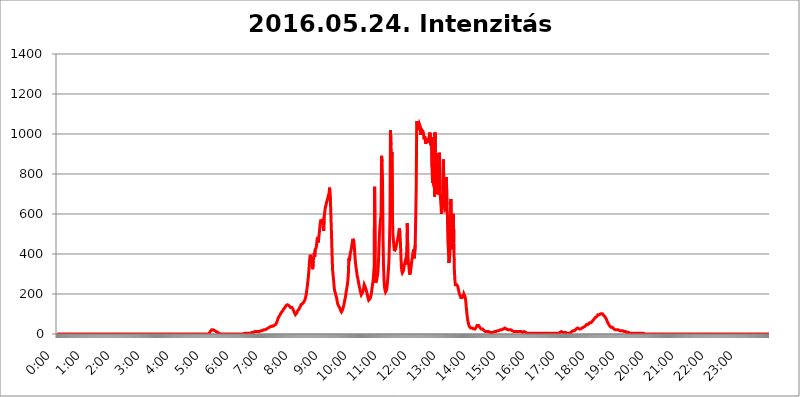
| Category | 2016.05.24. Intenzitás [W/m^2] |
|---|---|
| 0.0 | 0 |
| 0.0006944444444444445 | 0 |
| 0.001388888888888889 | 0 |
| 0.0020833333333333333 | 0 |
| 0.002777777777777778 | 0 |
| 0.003472222222222222 | 0 |
| 0.004166666666666667 | 0 |
| 0.004861111111111111 | 0 |
| 0.005555555555555556 | 0 |
| 0.0062499999999999995 | 0 |
| 0.006944444444444444 | 0 |
| 0.007638888888888889 | 0 |
| 0.008333333333333333 | 0 |
| 0.009027777777777779 | 0 |
| 0.009722222222222222 | 0 |
| 0.010416666666666666 | 0 |
| 0.011111111111111112 | 0 |
| 0.011805555555555555 | 0 |
| 0.012499999999999999 | 0 |
| 0.013194444444444444 | 0 |
| 0.013888888888888888 | 0 |
| 0.014583333333333332 | 0 |
| 0.015277777777777777 | 0 |
| 0.015972222222222224 | 0 |
| 0.016666666666666666 | 0 |
| 0.017361111111111112 | 0 |
| 0.018055555555555557 | 0 |
| 0.01875 | 0 |
| 0.019444444444444445 | 0 |
| 0.02013888888888889 | 0 |
| 0.020833333333333332 | 0 |
| 0.02152777777777778 | 0 |
| 0.022222222222222223 | 0 |
| 0.02291666666666667 | 0 |
| 0.02361111111111111 | 0 |
| 0.024305555555555556 | 0 |
| 0.024999999999999998 | 0 |
| 0.025694444444444447 | 0 |
| 0.02638888888888889 | 0 |
| 0.027083333333333334 | 0 |
| 0.027777777777777776 | 0 |
| 0.02847222222222222 | 0 |
| 0.029166666666666664 | 0 |
| 0.029861111111111113 | 0 |
| 0.030555555555555555 | 0 |
| 0.03125 | 0 |
| 0.03194444444444445 | 0 |
| 0.03263888888888889 | 0 |
| 0.03333333333333333 | 0 |
| 0.034027777777777775 | 0 |
| 0.034722222222222224 | 0 |
| 0.035416666666666666 | 0 |
| 0.036111111111111115 | 0 |
| 0.03680555555555556 | 0 |
| 0.0375 | 0 |
| 0.03819444444444444 | 0 |
| 0.03888888888888889 | 0 |
| 0.03958333333333333 | 0 |
| 0.04027777777777778 | 0 |
| 0.04097222222222222 | 0 |
| 0.041666666666666664 | 0 |
| 0.042361111111111106 | 0 |
| 0.04305555555555556 | 0 |
| 0.043750000000000004 | 0 |
| 0.044444444444444446 | 0 |
| 0.04513888888888889 | 0 |
| 0.04583333333333334 | 0 |
| 0.04652777777777778 | 0 |
| 0.04722222222222222 | 0 |
| 0.04791666666666666 | 0 |
| 0.04861111111111111 | 0 |
| 0.049305555555555554 | 0 |
| 0.049999999999999996 | 0 |
| 0.05069444444444445 | 0 |
| 0.051388888888888894 | 0 |
| 0.052083333333333336 | 0 |
| 0.05277777777777778 | 0 |
| 0.05347222222222222 | 0 |
| 0.05416666666666667 | 0 |
| 0.05486111111111111 | 0 |
| 0.05555555555555555 | 0 |
| 0.05625 | 0 |
| 0.05694444444444444 | 0 |
| 0.057638888888888885 | 0 |
| 0.05833333333333333 | 0 |
| 0.05902777777777778 | 0 |
| 0.059722222222222225 | 0 |
| 0.06041666666666667 | 0 |
| 0.061111111111111116 | 0 |
| 0.06180555555555556 | 0 |
| 0.0625 | 0 |
| 0.06319444444444444 | 0 |
| 0.06388888888888888 | 0 |
| 0.06458333333333334 | 0 |
| 0.06527777777777778 | 0 |
| 0.06597222222222222 | 0 |
| 0.06666666666666667 | 0 |
| 0.06736111111111111 | 0 |
| 0.06805555555555555 | 0 |
| 0.06874999999999999 | 0 |
| 0.06944444444444443 | 0 |
| 0.07013888888888889 | 0 |
| 0.07083333333333333 | 0 |
| 0.07152777777777779 | 0 |
| 0.07222222222222223 | 0 |
| 0.07291666666666667 | 0 |
| 0.07361111111111111 | 0 |
| 0.07430555555555556 | 0 |
| 0.075 | 0 |
| 0.07569444444444444 | 0 |
| 0.0763888888888889 | 0 |
| 0.07708333333333334 | 0 |
| 0.07777777777777778 | 0 |
| 0.07847222222222222 | 0 |
| 0.07916666666666666 | 0 |
| 0.0798611111111111 | 0 |
| 0.08055555555555556 | 0 |
| 0.08125 | 0 |
| 0.08194444444444444 | 0 |
| 0.08263888888888889 | 0 |
| 0.08333333333333333 | 0 |
| 0.08402777777777777 | 0 |
| 0.08472222222222221 | 0 |
| 0.08541666666666665 | 0 |
| 0.08611111111111112 | 0 |
| 0.08680555555555557 | 0 |
| 0.08750000000000001 | 0 |
| 0.08819444444444445 | 0 |
| 0.08888888888888889 | 0 |
| 0.08958333333333333 | 0 |
| 0.09027777777777778 | 0 |
| 0.09097222222222222 | 0 |
| 0.09166666666666667 | 0 |
| 0.09236111111111112 | 0 |
| 0.09305555555555556 | 0 |
| 0.09375 | 0 |
| 0.09444444444444444 | 0 |
| 0.09513888888888888 | 0 |
| 0.09583333333333333 | 0 |
| 0.09652777777777777 | 0 |
| 0.09722222222222222 | 0 |
| 0.09791666666666667 | 0 |
| 0.09861111111111111 | 0 |
| 0.09930555555555555 | 0 |
| 0.09999999999999999 | 0 |
| 0.10069444444444443 | 0 |
| 0.1013888888888889 | 0 |
| 0.10208333333333335 | 0 |
| 0.10277777777777779 | 0 |
| 0.10347222222222223 | 0 |
| 0.10416666666666667 | 0 |
| 0.10486111111111111 | 0 |
| 0.10555555555555556 | 0 |
| 0.10625 | 0 |
| 0.10694444444444444 | 0 |
| 0.1076388888888889 | 0 |
| 0.10833333333333334 | 0 |
| 0.10902777777777778 | 0 |
| 0.10972222222222222 | 0 |
| 0.1111111111111111 | 0 |
| 0.11180555555555556 | 0 |
| 0.11180555555555556 | 0 |
| 0.1125 | 0 |
| 0.11319444444444444 | 0 |
| 0.11388888888888889 | 0 |
| 0.11458333333333333 | 0 |
| 0.11527777777777777 | 0 |
| 0.11597222222222221 | 0 |
| 0.11666666666666665 | 0 |
| 0.1173611111111111 | 0 |
| 0.11805555555555557 | 0 |
| 0.11944444444444445 | 0 |
| 0.12013888888888889 | 0 |
| 0.12083333333333333 | 0 |
| 0.12152777777777778 | 0 |
| 0.12222222222222223 | 0 |
| 0.12291666666666667 | 0 |
| 0.12291666666666667 | 0 |
| 0.12361111111111112 | 0 |
| 0.12430555555555556 | 0 |
| 0.125 | 0 |
| 0.12569444444444444 | 0 |
| 0.12638888888888888 | 0 |
| 0.12708333333333333 | 0 |
| 0.16875 | 0 |
| 0.12847222222222224 | 0 |
| 0.12916666666666668 | 0 |
| 0.12986111111111112 | 0 |
| 0.13055555555555556 | 0 |
| 0.13125 | 0 |
| 0.13194444444444445 | 0 |
| 0.1326388888888889 | 0 |
| 0.13333333333333333 | 0 |
| 0.13402777777777777 | 0 |
| 0.13402777777777777 | 0 |
| 0.13472222222222222 | 0 |
| 0.13541666666666666 | 0 |
| 0.1361111111111111 | 0 |
| 0.13749999999999998 | 0 |
| 0.13819444444444443 | 0 |
| 0.1388888888888889 | 0 |
| 0.13958333333333334 | 0 |
| 0.14027777777777778 | 0 |
| 0.14097222222222222 | 0 |
| 0.14166666666666666 | 0 |
| 0.1423611111111111 | 0 |
| 0.14305555555555557 | 0 |
| 0.14375000000000002 | 0 |
| 0.14444444444444446 | 0 |
| 0.1451388888888889 | 0 |
| 0.1451388888888889 | 0 |
| 0.14652777777777778 | 0 |
| 0.14722222222222223 | 0 |
| 0.14791666666666667 | 0 |
| 0.1486111111111111 | 0 |
| 0.14930555555555555 | 0 |
| 0.15 | 0 |
| 0.15069444444444444 | 0 |
| 0.15138888888888888 | 0 |
| 0.15208333333333332 | 0 |
| 0.15277777777777776 | 0 |
| 0.15347222222222223 | 0 |
| 0.15416666666666667 | 0 |
| 0.15486111111111112 | 0 |
| 0.15555555555555556 | 0 |
| 0.15625 | 0 |
| 0.15694444444444444 | 0 |
| 0.15763888888888888 | 0 |
| 0.15833333333333333 | 0 |
| 0.15902777777777777 | 0 |
| 0.15972222222222224 | 0 |
| 0.16041666666666668 | 0 |
| 0.16111111111111112 | 0 |
| 0.16180555555555556 | 0 |
| 0.1625 | 0 |
| 0.16319444444444445 | 0 |
| 0.1638888888888889 | 0 |
| 0.16458333333333333 | 0 |
| 0.16527777777777777 | 0 |
| 0.16597222222222222 | 0 |
| 0.16666666666666666 | 0 |
| 0.1673611111111111 | 0 |
| 0.16805555555555554 | 0 |
| 0.16874999999999998 | 0 |
| 0.16944444444444443 | 0 |
| 0.17013888888888887 | 0 |
| 0.1708333333333333 | 0 |
| 0.17152777777777775 | 0 |
| 0.17222222222222225 | 0 |
| 0.1729166666666667 | 0 |
| 0.17361111111111113 | 0 |
| 0.17430555555555557 | 0 |
| 0.17500000000000002 | 0 |
| 0.17569444444444446 | 0 |
| 0.1763888888888889 | 0 |
| 0.17708333333333334 | 0 |
| 0.17777777777777778 | 0 |
| 0.17847222222222223 | 0 |
| 0.17916666666666667 | 0 |
| 0.1798611111111111 | 0 |
| 0.18055555555555555 | 0 |
| 0.18125 | 0 |
| 0.18194444444444444 | 0 |
| 0.1826388888888889 | 0 |
| 0.18333333333333335 | 0 |
| 0.1840277777777778 | 0 |
| 0.18472222222222223 | 0 |
| 0.18541666666666667 | 0 |
| 0.18611111111111112 | 0 |
| 0.18680555555555556 | 0 |
| 0.1875 | 0 |
| 0.18819444444444444 | 0 |
| 0.18888888888888888 | 0 |
| 0.18958333333333333 | 0 |
| 0.19027777777777777 | 0 |
| 0.1909722222222222 | 0 |
| 0.19166666666666665 | 0 |
| 0.19236111111111112 | 0 |
| 0.19305555555555554 | 0 |
| 0.19375 | 0 |
| 0.19444444444444445 | 0 |
| 0.1951388888888889 | 0 |
| 0.19583333333333333 | 0 |
| 0.19652777777777777 | 0 |
| 0.19722222222222222 | 0 |
| 0.19791666666666666 | 0 |
| 0.1986111111111111 | 0 |
| 0.19930555555555554 | 0 |
| 0.19999999999999998 | 0 |
| 0.20069444444444443 | 0 |
| 0.20138888888888887 | 0 |
| 0.2020833333333333 | 0 |
| 0.2027777777777778 | 0 |
| 0.2034722222222222 | 0 |
| 0.2041666666666667 | 0 |
| 0.20486111111111113 | 0 |
| 0.20555555555555557 | 0 |
| 0.20625000000000002 | 0 |
| 0.20694444444444446 | 0 |
| 0.2076388888888889 | 0 |
| 0.20833333333333334 | 0 |
| 0.20902777777777778 | 0 |
| 0.20972222222222223 | 0 |
| 0.21041666666666667 | 0 |
| 0.2111111111111111 | 0 |
| 0.21180555555555555 | 0 |
| 0.2125 | 0 |
| 0.21319444444444444 | 3.525 |
| 0.2138888888888889 | 3.525 |
| 0.21458333333333335 | 12.257 |
| 0.2152777777777778 | 12.257 |
| 0.21597222222222223 | 16.636 |
| 0.21666666666666667 | 21.024 |
| 0.21736111111111112 | 21.024 |
| 0.21805555555555556 | 21.024 |
| 0.21875 | 21.024 |
| 0.21944444444444444 | 16.636 |
| 0.22013888888888888 | 16.636 |
| 0.22083333333333333 | 16.636 |
| 0.22152777777777777 | 16.636 |
| 0.2222222222222222 | 12.257 |
| 0.22291666666666665 | 12.257 |
| 0.2236111111111111 | 7.887 |
| 0.22430555555555556 | 7.887 |
| 0.225 | 7.887 |
| 0.22569444444444445 | 3.525 |
| 0.2263888888888889 | 3.525 |
| 0.22708333333333333 | 3.525 |
| 0.22777777777777777 | 3.525 |
| 0.22847222222222222 | 0 |
| 0.22916666666666666 | 0 |
| 0.2298611111111111 | 0 |
| 0.23055555555555554 | 0 |
| 0.23124999999999998 | 0 |
| 0.23194444444444443 | 0 |
| 0.23263888888888887 | 0 |
| 0.2333333333333333 | 0 |
| 0.2340277777777778 | 0 |
| 0.2347222222222222 | 0 |
| 0.2354166666666667 | 0 |
| 0.23611111111111113 | 0 |
| 0.23680555555555557 | 0 |
| 0.23750000000000002 | 0 |
| 0.23819444444444446 | 0 |
| 0.2388888888888889 | 0 |
| 0.23958333333333334 | 0 |
| 0.24027777777777778 | 0 |
| 0.24097222222222223 | 0 |
| 0.24166666666666667 | 0 |
| 0.2423611111111111 | 0 |
| 0.24305555555555555 | 0 |
| 0.24375 | 0 |
| 0.24444444444444446 | 0 |
| 0.24513888888888888 | 0 |
| 0.24583333333333335 | 0 |
| 0.2465277777777778 | 0 |
| 0.24722222222222223 | 0 |
| 0.24791666666666667 | 0 |
| 0.24861111111111112 | 0 |
| 0.24930555555555556 | 0 |
| 0.25 | 0 |
| 0.25069444444444444 | 0 |
| 0.2513888888888889 | 0 |
| 0.2520833333333333 | 0 |
| 0.25277777777777777 | 0 |
| 0.2534722222222222 | 0 |
| 0.25416666666666665 | 0 |
| 0.2548611111111111 | 0 |
| 0.2555555555555556 | 0 |
| 0.25625000000000003 | 0 |
| 0.2569444444444445 | 0 |
| 0.2576388888888889 | 0 |
| 0.25833333333333336 | 0 |
| 0.2590277777777778 | 0 |
| 0.25972222222222224 | 0 |
| 0.2604166666666667 | 0 |
| 0.2611111111111111 | 3.525 |
| 0.26180555555555557 | 3.525 |
| 0.2625 | 3.525 |
| 0.26319444444444445 | 3.525 |
| 0.2638888888888889 | 3.525 |
| 0.26458333333333334 | 3.525 |
| 0.2652777777777778 | 3.525 |
| 0.2659722222222222 | 3.525 |
| 0.26666666666666666 | 3.525 |
| 0.2673611111111111 | 3.525 |
| 0.26805555555555555 | 3.525 |
| 0.26875 | 3.525 |
| 0.26944444444444443 | 3.525 |
| 0.2701388888888889 | 3.525 |
| 0.2708333333333333 | 3.525 |
| 0.27152777777777776 | 3.525 |
| 0.2722222222222222 | 7.887 |
| 0.27291666666666664 | 7.887 |
| 0.2736111111111111 | 7.887 |
| 0.2743055555555555 | 7.887 |
| 0.27499999999999997 | 7.887 |
| 0.27569444444444446 | 7.887 |
| 0.27638888888888885 | 12.257 |
| 0.27708333333333335 | 12.257 |
| 0.2777777777777778 | 12.257 |
| 0.27847222222222223 | 12.257 |
| 0.2791666666666667 | 12.257 |
| 0.2798611111111111 | 12.257 |
| 0.28055555555555556 | 12.257 |
| 0.28125 | 12.257 |
| 0.28194444444444444 | 12.257 |
| 0.2826388888888889 | 12.257 |
| 0.2833333333333333 | 12.257 |
| 0.28402777777777777 | 12.257 |
| 0.2847222222222222 | 12.257 |
| 0.28541666666666665 | 16.636 |
| 0.28611111111111115 | 16.636 |
| 0.28680555555555554 | 16.636 |
| 0.28750000000000003 | 16.636 |
| 0.2881944444444445 | 16.636 |
| 0.2888888888888889 | 16.636 |
| 0.28958333333333336 | 21.024 |
| 0.2902777777777778 | 21.024 |
| 0.29097222222222224 | 21.024 |
| 0.2916666666666667 | 21.024 |
| 0.2923611111111111 | 21.024 |
| 0.29305555555555557 | 21.024 |
| 0.29375 | 25.419 |
| 0.29444444444444445 | 25.419 |
| 0.2951388888888889 | 29.823 |
| 0.29583333333333334 | 29.823 |
| 0.2965277777777778 | 29.823 |
| 0.2972222222222222 | 29.823 |
| 0.29791666666666666 | 34.234 |
| 0.2986111111111111 | 34.234 |
| 0.29930555555555555 | 38.653 |
| 0.3 | 38.653 |
| 0.30069444444444443 | 38.653 |
| 0.3013888888888889 | 38.653 |
| 0.3020833333333333 | 38.653 |
| 0.30277777777777776 | 43.079 |
| 0.3034722222222222 | 43.079 |
| 0.30416666666666664 | 43.079 |
| 0.3048611111111111 | 43.079 |
| 0.3055555555555555 | 47.511 |
| 0.30624999999999997 | 47.511 |
| 0.3069444444444444 | 51.951 |
| 0.3076388888888889 | 56.398 |
| 0.30833333333333335 | 60.85 |
| 0.3090277777777778 | 69.775 |
| 0.30972222222222223 | 78.722 |
| 0.3104166666666667 | 83.205 |
| 0.3111111111111111 | 87.692 |
| 0.31180555555555556 | 92.184 |
| 0.3125 | 96.682 |
| 0.31319444444444444 | 101.184 |
| 0.3138888888888889 | 105.69 |
| 0.3145833333333333 | 110.201 |
| 0.31527777777777777 | 110.201 |
| 0.3159722222222222 | 114.716 |
| 0.31666666666666665 | 119.235 |
| 0.31736111111111115 | 123.758 |
| 0.31805555555555554 | 128.284 |
| 0.31875000000000003 | 128.284 |
| 0.3194444444444445 | 132.814 |
| 0.3201388888888889 | 137.347 |
| 0.32083333333333336 | 141.884 |
| 0.3215277777777778 | 146.423 |
| 0.32222222222222224 | 146.423 |
| 0.3229166666666667 | 146.423 |
| 0.3236111111111111 | 146.423 |
| 0.32430555555555557 | 141.884 |
| 0.325 | 141.884 |
| 0.32569444444444445 | 137.347 |
| 0.3263888888888889 | 137.347 |
| 0.32708333333333334 | 132.814 |
| 0.3277777777777778 | 132.814 |
| 0.3284722222222222 | 132.814 |
| 0.32916666666666666 | 132.814 |
| 0.3298611111111111 | 132.814 |
| 0.33055555555555555 | 128.284 |
| 0.33125 | 119.235 |
| 0.33194444444444443 | 114.716 |
| 0.3326388888888889 | 105.69 |
| 0.3333333333333333 | 101.184 |
| 0.3340277777777778 | 96.682 |
| 0.3347222222222222 | 96.682 |
| 0.3354166666666667 | 101.184 |
| 0.3361111111111111 | 105.69 |
| 0.3368055555555556 | 114.716 |
| 0.33749999999999997 | 119.235 |
| 0.33819444444444446 | 119.235 |
| 0.33888888888888885 | 123.758 |
| 0.33958333333333335 | 123.758 |
| 0.34027777777777773 | 128.284 |
| 0.34097222222222223 | 137.347 |
| 0.3416666666666666 | 146.423 |
| 0.3423611111111111 | 146.423 |
| 0.3430555555555555 | 146.423 |
| 0.34375 | 150.964 |
| 0.3444444444444445 | 150.964 |
| 0.3451388888888889 | 155.509 |
| 0.3458333333333334 | 160.056 |
| 0.34652777777777777 | 164.605 |
| 0.34722222222222227 | 169.156 |
| 0.34791666666666665 | 173.709 |
| 0.34861111111111115 | 187.378 |
| 0.34930555555555554 | 201.058 |
| 0.35000000000000003 | 219.309 |
| 0.3506944444444444 | 237.564 |
| 0.3513888888888889 | 260.373 |
| 0.3520833333333333 | 283.156 |
| 0.3527777777777778 | 310.44 |
| 0.3534722222222222 | 346.682 |
| 0.3541666666666667 | 378.224 |
| 0.3548611111111111 | 396.164 |
| 0.35555555555555557 | 387.202 |
| 0.35625 | 373.729 |
| 0.35694444444444445 | 351.198 |
| 0.3576388888888889 | 337.639 |
| 0.35833333333333334 | 324.052 |
| 0.3590277777777778 | 364.728 |
| 0.3597222222222222 | 387.202 |
| 0.36041666666666666 | 405.108 |
| 0.3611111111111111 | 387.202 |
| 0.36180555555555555 | 422.943 |
| 0.3625 | 418.492 |
| 0.36319444444444443 | 431.833 |
| 0.3638888888888889 | 449.551 |
| 0.3645833333333333 | 475.972 |
| 0.3652777777777778 | 484.735 |
| 0.3659722222222222 | 458.38 |
| 0.3666666666666667 | 475.972 |
| 0.3673611111111111 | 475.972 |
| 0.3680555555555556 | 523.88 |
| 0.36874999999999997 | 549.704 |
| 0.36944444444444446 | 566.793 |
| 0.37013888888888885 | 566.793 |
| 0.37083333333333335 | 566.793 |
| 0.37152777777777773 | 566.793 |
| 0.37222222222222223 | 575.299 |
| 0.3729166666666666 | 575.299 |
| 0.3736111111111111 | 515.223 |
| 0.3743055555555555 | 583.779 |
| 0.375 | 604.864 |
| 0.3756944444444445 | 625.784 |
| 0.3763888888888889 | 638.256 |
| 0.3770833333333334 | 646.537 |
| 0.37777777777777777 | 658.909 |
| 0.37847222222222227 | 667.123 |
| 0.37916666666666665 | 675.311 |
| 0.37986111111111115 | 687.544 |
| 0.38055555555555554 | 687.544 |
| 0.38125000000000003 | 703.762 |
| 0.3819444444444444 | 731.896 |
| 0.3826388888888889 | 731.896 |
| 0.3833333333333333 | 646.537 |
| 0.3840277777777778 | 646.537 |
| 0.3847222222222222 | 489.108 |
| 0.3854166666666667 | 400.638 |
| 0.3861111111111111 | 324.052 |
| 0.38680555555555557 | 296.808 |
| 0.3875 | 274.047 |
| 0.38819444444444445 | 242.127 |
| 0.3888888888888889 | 219.309 |
| 0.38958333333333334 | 210.182 |
| 0.3902777777777778 | 201.058 |
| 0.3909722222222222 | 196.497 |
| 0.39166666666666666 | 182.82 |
| 0.3923611111111111 | 169.156 |
| 0.39305555555555555 | 155.509 |
| 0.39375 | 146.423 |
| 0.39444444444444443 | 141.884 |
| 0.3951388888888889 | 137.347 |
| 0.3958333333333333 | 137.347 |
| 0.3965277777777778 | 128.284 |
| 0.3972222222222222 | 119.235 |
| 0.3979166666666667 | 114.716 |
| 0.3986111111111111 | 110.201 |
| 0.3993055555555556 | 114.716 |
| 0.39999999999999997 | 119.235 |
| 0.40069444444444446 | 128.284 |
| 0.40138888888888885 | 137.347 |
| 0.40208333333333335 | 146.423 |
| 0.40277777777777773 | 160.056 |
| 0.40347222222222223 | 173.709 |
| 0.4041666666666666 | 182.82 |
| 0.4048611111111111 | 201.058 |
| 0.4055555555555555 | 219.309 |
| 0.40625 | 233 |
| 0.4069444444444445 | 246.689 |
| 0.4076388888888889 | 269.49 |
| 0.4083333333333334 | 305.898 |
| 0.40902777777777777 | 378.224 |
| 0.40972222222222227 | 364.728 |
| 0.41041666666666665 | 387.202 |
| 0.41111111111111115 | 405.108 |
| 0.41180555555555554 | 409.574 |
| 0.41250000000000003 | 427.39 |
| 0.4131944444444444 | 445.129 |
| 0.4138888888888889 | 458.38 |
| 0.4145833333333333 | 475.972 |
| 0.4152777777777778 | 475.972 |
| 0.4159722222222222 | 462.786 |
| 0.4166666666666667 | 436.27 |
| 0.4173611111111111 | 396.164 |
| 0.41805555555555557 | 364.728 |
| 0.41875 | 342.162 |
| 0.41944444444444445 | 324.052 |
| 0.4201388888888889 | 305.898 |
| 0.42083333333333334 | 287.709 |
| 0.4215277777777778 | 278.603 |
| 0.4222222222222222 | 264.932 |
| 0.42291666666666666 | 251.251 |
| 0.4236111111111111 | 237.564 |
| 0.42430555555555555 | 228.436 |
| 0.425 | 214.746 |
| 0.42569444444444443 | 205.62 |
| 0.4263888888888889 | 196.497 |
| 0.4270833333333333 | 196.497 |
| 0.4277777777777778 | 196.497 |
| 0.4284722222222222 | 210.182 |
| 0.4291666666666667 | 219.309 |
| 0.4298611111111111 | 233 |
| 0.4305555555555556 | 246.689 |
| 0.43124999999999997 | 251.251 |
| 0.43194444444444446 | 242.127 |
| 0.43263888888888885 | 228.436 |
| 0.43333333333333335 | 219.309 |
| 0.43402777777777773 | 210.182 |
| 0.43472222222222223 | 201.058 |
| 0.4354166666666666 | 187.378 |
| 0.4361111111111111 | 178.264 |
| 0.4368055555555555 | 169.156 |
| 0.4375 | 169.156 |
| 0.4381944444444445 | 169.156 |
| 0.4388888888888889 | 178.264 |
| 0.4395833333333334 | 187.378 |
| 0.44027777777777777 | 196.497 |
| 0.44097222222222227 | 214.746 |
| 0.44166666666666665 | 233 |
| 0.44236111111111115 | 251.251 |
| 0.44305555555555554 | 269.49 |
| 0.44375000000000003 | 301.354 |
| 0.4444444444444444 | 333.113 |
| 0.4451388888888889 | 735.89 |
| 0.4458333333333333 | 405.108 |
| 0.4465277777777778 | 255.813 |
| 0.4472222222222222 | 260.373 |
| 0.4479166666666667 | 269.49 |
| 0.4486111111111111 | 283.156 |
| 0.44930555555555557 | 296.808 |
| 0.45 | 324.052 |
| 0.45069444444444445 | 378.224 |
| 0.4513888888888889 | 445.129 |
| 0.45208333333333334 | 510.885 |
| 0.4527777777777778 | 549.704 |
| 0.4534722222222222 | 575.299 |
| 0.45416666666666666 | 596.45 |
| 0.4548611111111111 | 891.099 |
| 0.45555555555555555 | 860.676 |
| 0.45625 | 763.674 |
| 0.45694444444444443 | 475.972 |
| 0.4576388888888889 | 337.639 |
| 0.4583333333333333 | 269.49 |
| 0.4590277777777778 | 233 |
| 0.4597222222222222 | 219.309 |
| 0.4604166666666667 | 210.182 |
| 0.4611111111111111 | 210.182 |
| 0.4618055555555556 | 219.309 |
| 0.46249999999999997 | 233 |
| 0.46319444444444446 | 260.373 |
| 0.46388888888888885 | 292.259 |
| 0.46458333333333335 | 328.584 |
| 0.46527777777777773 | 373.729 |
| 0.46597222222222223 | 458.38 |
| 0.4666666666666666 | 579.542 |
| 0.4673611111111111 | 1018.587 |
| 0.4680555555555555 | 943.832 |
| 0.46875 | 891.099 |
| 0.4694444444444445 | 909.996 |
| 0.4701388888888889 | 583.779 |
| 0.4708333333333334 | 497.836 |
| 0.47152777777777777 | 467.187 |
| 0.47222222222222227 | 436.27 |
| 0.47291666666666665 | 414.035 |
| 0.47361111111111115 | 409.574 |
| 0.47430555555555554 | 414.035 |
| 0.47500000000000003 | 431.833 |
| 0.4756944444444444 | 445.129 |
| 0.4763888888888889 | 458.38 |
| 0.4770833333333333 | 467.187 |
| 0.4777777777777778 | 480.356 |
| 0.4784722222222222 | 497.836 |
| 0.4791666666666667 | 515.223 |
| 0.4798611111111111 | 528.2 |
| 0.48055555555555557 | 506.542 |
| 0.48125 | 458.38 |
| 0.48194444444444445 | 396.164 |
| 0.4826388888888889 | 337.639 |
| 0.48333333333333334 | 314.98 |
| 0.4840277777777778 | 305.898 |
| 0.4847222222222222 | 305.898 |
| 0.48541666666666666 | 314.98 |
| 0.4861111111111111 | 328.584 |
| 0.48680555555555555 | 346.682 |
| 0.4875 | 355.712 |
| 0.48819444444444443 | 346.682 |
| 0.4888888888888889 | 364.728 |
| 0.4895833333333333 | 382.715 |
| 0.4902777777777778 | 422.943 |
| 0.4909722222222222 | 553.986 |
| 0.4916666666666667 | 400.638 |
| 0.4923611111111111 | 360.221 |
| 0.4930555555555556 | 342.162 |
| 0.49374999999999997 | 314.98 |
| 0.49444444444444446 | 296.808 |
| 0.49513888888888885 | 296.808 |
| 0.49583333333333335 | 324.052 |
| 0.49652777777777773 | 342.162 |
| 0.49722222222222223 | 364.728 |
| 0.4979166666666666 | 369.23 |
| 0.4986111111111111 | 369.23 |
| 0.4993055555555555 | 414.035 |
| 0.5 | 422.943 |
| 0.5006944444444444 | 378.224 |
| 0.5013888888888889 | 373.729 |
| 0.5020833333333333 | 445.129 |
| 0.5027777777777778 | 588.009 |
| 0.5034722222222222 | 723.889 |
| 0.5041666666666667 | 1063.51 |
| 0.5048611111111111 | 1063.51 |
| 0.5055555555555555 | 1044.762 |
| 0.50625 | 1037.277 |
| 0.5069444444444444 | 1041.019 |
| 0.5076388888888889 | 1052.255 |
| 0.5083333333333333 | 1048.508 |
| 0.5090277777777777 | 1037.277 |
| 0.5097222222222222 | 996.182 |
| 0.5104166666666666 | 1026.06 |
| 0.5111111111111112 | 1022.323 |
| 0.5118055555555555 | 1018.587 |
| 0.5125000000000001 | 1014.852 |
| 0.5131944444444444 | 1011.118 |
| 0.513888888888889 | 1007.383 |
| 0.5145833333333333 | 973.772 |
| 0.5152777777777778 | 988.714 |
| 0.5159722222222222 | 981.244 |
| 0.5166666666666667 | 951.327 |
| 0.517361111111111 | 958.814 |
| 0.5180555555555556 | 962.555 |
| 0.5187499999999999 | 977.508 |
| 0.5194444444444445 | 962.555 |
| 0.5201388888888888 | 955.071 |
| 0.5208333333333334 | 970.034 |
| 0.5215277777777778 | 970.034 |
| 0.5222222222222223 | 999.916 |
| 0.5229166666666667 | 1007.383 |
| 0.5236111111111111 | 943.832 |
| 0.5243055555555556 | 977.508 |
| 0.525 | 984.98 |
| 0.5256944444444445 | 833.834 |
| 0.5263888888888889 | 755.766 |
| 0.5270833333333333 | 853.029 |
| 0.5277777777777778 | 743.859 |
| 0.5284722222222222 | 818.392 |
| 0.5291666666666667 | 687.544 |
| 0.5298611111111111 | 1007.383 |
| 0.5305555555555556 | 798.974 |
| 0.53125 | 860.676 |
| 0.5319444444444444 | 806.757 |
| 0.5326388888888889 | 715.858 |
| 0.5333333333333333 | 699.717 |
| 0.5340277777777778 | 902.447 |
| 0.5347222222222222 | 703.762 |
| 0.5354166666666667 | 695.666 |
| 0.5361111111111111 | 906.223 |
| 0.5368055555555555 | 719.877 |
| 0.5375 | 719.877 |
| 0.5381944444444444 | 642.4 |
| 0.5388888888888889 | 600.661 |
| 0.5395833333333333 | 617.436 |
| 0.5402777777777777 | 675.311 |
| 0.5409722222222222 | 715.858 |
| 0.5416666666666666 | 872.114 |
| 0.5423611111111112 | 658.909 |
| 0.5430555555555555 | 634.105 |
| 0.5437500000000001 | 625.784 |
| 0.5444444444444444 | 634.105 |
| 0.545138888888889 | 625.784 |
| 0.5458333333333333 | 783.342 |
| 0.5465277777777778 | 646.537 |
| 0.5472222222222222 | 596.45 |
| 0.5479166666666667 | 462.786 |
| 0.548611111111111 | 418.492 |
| 0.5493055555555556 | 355.712 |
| 0.5499999999999999 | 378.224 |
| 0.5506944444444445 | 405.108 |
| 0.5513888888888888 | 467.187 |
| 0.5520833333333334 | 675.311 |
| 0.5527777777777778 | 449.551 |
| 0.5534722222222223 | 422.943 |
| 0.5541666666666667 | 422.943 |
| 0.5548611111111111 | 436.27 |
| 0.5555555555555556 | 600.661 |
| 0.55625 | 458.38 |
| 0.5569444444444445 | 324.052 |
| 0.5576388888888889 | 274.047 |
| 0.5583333333333333 | 246.689 |
| 0.5590277777777778 | 242.127 |
| 0.5597222222222222 | 242.127 |
| 0.5604166666666667 | 246.689 |
| 0.5611111111111111 | 246.689 |
| 0.5618055555555556 | 237.564 |
| 0.5625 | 223.873 |
| 0.5631944444444444 | 214.746 |
| 0.5638888888888889 | 201.058 |
| 0.5645833333333333 | 196.497 |
| 0.5652777777777778 | 191.937 |
| 0.5659722222222222 | 182.82 |
| 0.5666666666666667 | 182.82 |
| 0.5673611111111111 | 182.82 |
| 0.5680555555555555 | 182.82 |
| 0.56875 | 187.378 |
| 0.5694444444444444 | 191.937 |
| 0.5701388888888889 | 201.058 |
| 0.5708333333333333 | 201.058 |
| 0.5715277777777777 | 196.497 |
| 0.5722222222222222 | 182.82 |
| 0.5729166666666666 | 164.605 |
| 0.5736111111111112 | 137.347 |
| 0.5743055555555555 | 110.201 |
| 0.5750000000000001 | 87.692 |
| 0.5756944444444444 | 69.775 |
| 0.576388888888889 | 56.398 |
| 0.5770833333333333 | 47.511 |
| 0.5777777777777778 | 38.653 |
| 0.5784722222222222 | 34.234 |
| 0.5791666666666667 | 34.234 |
| 0.579861111111111 | 29.823 |
| 0.5805555555555556 | 29.823 |
| 0.5812499999999999 | 29.823 |
| 0.5819444444444445 | 29.823 |
| 0.5826388888888888 | 25.419 |
| 0.5833333333333334 | 25.419 |
| 0.5840277777777778 | 25.419 |
| 0.5847222222222223 | 25.419 |
| 0.5854166666666667 | 25.419 |
| 0.5861111111111111 | 25.419 |
| 0.5868055555555556 | 29.823 |
| 0.5875 | 34.234 |
| 0.5881944444444445 | 38.653 |
| 0.5888888888888889 | 43.079 |
| 0.5895833333333333 | 43.079 |
| 0.5902777777777778 | 47.511 |
| 0.5909722222222222 | 43.079 |
| 0.5916666666666667 | 38.653 |
| 0.5923611111111111 | 34.234 |
| 0.5930555555555556 | 29.823 |
| 0.59375 | 29.823 |
| 0.5944444444444444 | 25.419 |
| 0.5951388888888889 | 25.419 |
| 0.5958333333333333 | 25.419 |
| 0.5965277777777778 | 25.419 |
| 0.5972222222222222 | 21.024 |
| 0.5979166666666667 | 21.024 |
| 0.5986111111111111 | 16.636 |
| 0.5993055555555555 | 12.257 |
| 0.6 | 12.257 |
| 0.6006944444444444 | 12.257 |
| 0.6013888888888889 | 12.257 |
| 0.6020833333333333 | 12.257 |
| 0.6027777777777777 | 12.257 |
| 0.6034722222222222 | 12.257 |
| 0.6041666666666666 | 12.257 |
| 0.6048611111111112 | 12.257 |
| 0.6055555555555555 | 12.257 |
| 0.6062500000000001 | 7.887 |
| 0.6069444444444444 | 7.887 |
| 0.607638888888889 | 7.887 |
| 0.6083333333333333 | 7.887 |
| 0.6090277777777778 | 7.887 |
| 0.6097222222222222 | 7.887 |
| 0.6104166666666667 | 7.887 |
| 0.611111111111111 | 7.887 |
| 0.6118055555555556 | 7.887 |
| 0.6124999999999999 | 12.257 |
| 0.6131944444444445 | 12.257 |
| 0.6138888888888888 | 12.257 |
| 0.6145833333333334 | 12.257 |
| 0.6152777777777778 | 12.257 |
| 0.6159722222222223 | 12.257 |
| 0.6166666666666667 | 12.257 |
| 0.6173611111111111 | 16.636 |
| 0.6180555555555556 | 16.636 |
| 0.61875 | 16.636 |
| 0.6194444444444445 | 16.636 |
| 0.6201388888888889 | 16.636 |
| 0.6208333333333333 | 21.024 |
| 0.6215277777777778 | 21.024 |
| 0.6222222222222222 | 16.636 |
| 0.6229166666666667 | 16.636 |
| 0.6236111111111111 | 21.024 |
| 0.6243055555555556 | 21.024 |
| 0.625 | 21.024 |
| 0.6256944444444444 | 25.419 |
| 0.6263888888888889 | 29.823 |
| 0.6270833333333333 | 29.823 |
| 0.6277777777777778 | 29.823 |
| 0.6284722222222222 | 29.823 |
| 0.6291666666666667 | 29.823 |
| 0.6298611111111111 | 25.419 |
| 0.6305555555555555 | 25.419 |
| 0.63125 | 21.024 |
| 0.6319444444444444 | 21.024 |
| 0.6326388888888889 | 21.024 |
| 0.6333333333333333 | 21.024 |
| 0.6340277777777777 | 21.024 |
| 0.6347222222222222 | 21.024 |
| 0.6354166666666666 | 16.636 |
| 0.6361111111111112 | 21.024 |
| 0.6368055555555555 | 16.636 |
| 0.6375000000000001 | 16.636 |
| 0.6381944444444444 | 16.636 |
| 0.638888888888889 | 12.257 |
| 0.6395833333333333 | 12.257 |
| 0.6402777777777778 | 12.257 |
| 0.6409722222222222 | 12.257 |
| 0.6416666666666667 | 12.257 |
| 0.642361111111111 | 12.257 |
| 0.6430555555555556 | 12.257 |
| 0.6437499999999999 | 12.257 |
| 0.6444444444444445 | 12.257 |
| 0.6451388888888888 | 12.257 |
| 0.6458333333333334 | 12.257 |
| 0.6465277777777778 | 12.257 |
| 0.6472222222222223 | 12.257 |
| 0.6479166666666667 | 12.257 |
| 0.6486111111111111 | 12.257 |
| 0.6493055555555556 | 12.257 |
| 0.65 | 12.257 |
| 0.6506944444444445 | 12.257 |
| 0.6513888888888889 | 12.257 |
| 0.6520833333333333 | 12.257 |
| 0.6527777777777778 | 7.887 |
| 0.6534722222222222 | 7.887 |
| 0.6541666666666667 | 7.887 |
| 0.6548611111111111 | 12.257 |
| 0.6555555555555556 | 7.887 |
| 0.65625 | 7.887 |
| 0.6569444444444444 | 7.887 |
| 0.6576388888888889 | 3.525 |
| 0.6583333333333333 | 3.525 |
| 0.6590277777777778 | 3.525 |
| 0.6597222222222222 | 3.525 |
| 0.6604166666666667 | 3.525 |
| 0.6611111111111111 | 3.525 |
| 0.6618055555555555 | 3.525 |
| 0.6625 | 3.525 |
| 0.6631944444444444 | 3.525 |
| 0.6638888888888889 | 3.525 |
| 0.6645833333333333 | 3.525 |
| 0.6652777777777777 | 3.525 |
| 0.6659722222222222 | 3.525 |
| 0.6666666666666666 | 3.525 |
| 0.6673611111111111 | 3.525 |
| 0.6680555555555556 | 3.525 |
| 0.6687500000000001 | 3.525 |
| 0.6694444444444444 | 3.525 |
| 0.6701388888888888 | 3.525 |
| 0.6708333333333334 | 3.525 |
| 0.6715277777777778 | 3.525 |
| 0.6722222222222222 | 3.525 |
| 0.6729166666666666 | 3.525 |
| 0.6736111111111112 | 3.525 |
| 0.6743055555555556 | 3.525 |
| 0.6749999999999999 | 3.525 |
| 0.6756944444444444 | 3.525 |
| 0.6763888888888889 | 3.525 |
| 0.6770833333333334 | 3.525 |
| 0.6777777777777777 | 3.525 |
| 0.6784722222222223 | 3.525 |
| 0.6791666666666667 | 3.525 |
| 0.6798611111111111 | 3.525 |
| 0.6805555555555555 | 3.525 |
| 0.68125 | 3.525 |
| 0.6819444444444445 | 3.525 |
| 0.6826388888888889 | 3.525 |
| 0.6833333333333332 | 3.525 |
| 0.6840277777777778 | 3.525 |
| 0.6847222222222222 | 3.525 |
| 0.6854166666666667 | 3.525 |
| 0.686111111111111 | 3.525 |
| 0.6868055555555556 | 3.525 |
| 0.6875 | 3.525 |
| 0.6881944444444444 | 3.525 |
| 0.688888888888889 | 3.525 |
| 0.6895833333333333 | 3.525 |
| 0.6902777777777778 | 3.525 |
| 0.6909722222222222 | 3.525 |
| 0.6916666666666668 | 3.525 |
| 0.6923611111111111 | 3.525 |
| 0.6930555555555555 | 3.525 |
| 0.69375 | 3.525 |
| 0.6944444444444445 | 3.525 |
| 0.6951388888888889 | 3.525 |
| 0.6958333333333333 | 3.525 |
| 0.6965277777777777 | 3.525 |
| 0.6972222222222223 | 3.525 |
| 0.6979166666666666 | 3.525 |
| 0.6986111111111111 | 3.525 |
| 0.6993055555555556 | 3.525 |
| 0.7000000000000001 | 3.525 |
| 0.7006944444444444 | 3.525 |
| 0.7013888888888888 | 3.525 |
| 0.7020833333333334 | 3.525 |
| 0.7027777777777778 | 3.525 |
| 0.7034722222222222 | 3.525 |
| 0.7041666666666666 | 7.887 |
| 0.7048611111111112 | 7.887 |
| 0.7055555555555556 | 7.887 |
| 0.7062499999999999 | 12.257 |
| 0.7069444444444444 | 12.257 |
| 0.7076388888888889 | 12.257 |
| 0.7083333333333334 | 12.257 |
| 0.7090277777777777 | 7.887 |
| 0.7097222222222223 | 7.887 |
| 0.7104166666666667 | 7.887 |
| 0.7111111111111111 | 7.887 |
| 0.7118055555555555 | 7.887 |
| 0.7125 | 7.887 |
| 0.7131944444444445 | 7.887 |
| 0.7138888888888889 | 7.887 |
| 0.7145833333333332 | 7.887 |
| 0.7152777777777778 | 3.525 |
| 0.7159722222222222 | 3.525 |
| 0.7166666666666667 | 3.525 |
| 0.717361111111111 | 3.525 |
| 0.7180555555555556 | 3.525 |
| 0.71875 | 3.525 |
| 0.7194444444444444 | 3.525 |
| 0.720138888888889 | 7.887 |
| 0.7208333333333333 | 7.887 |
| 0.7215277777777778 | 12.257 |
| 0.7222222222222222 | 12.257 |
| 0.7229166666666668 | 16.636 |
| 0.7236111111111111 | 16.636 |
| 0.7243055555555555 | 16.636 |
| 0.725 | 16.636 |
| 0.7256944444444445 | 16.636 |
| 0.7263888888888889 | 21.024 |
| 0.7270833333333333 | 21.024 |
| 0.7277777777777777 | 25.419 |
| 0.7284722222222223 | 25.419 |
| 0.7291666666666666 | 25.419 |
| 0.7298611111111111 | 29.823 |
| 0.7305555555555556 | 25.419 |
| 0.7312500000000001 | 25.419 |
| 0.7319444444444444 | 25.419 |
| 0.7326388888888888 | 25.419 |
| 0.7333333333333334 | 25.419 |
| 0.7340277777777778 | 25.419 |
| 0.7347222222222222 | 25.419 |
| 0.7354166666666666 | 29.823 |
| 0.7361111111111112 | 29.823 |
| 0.7368055555555556 | 29.823 |
| 0.7374999999999999 | 29.823 |
| 0.7381944444444444 | 34.234 |
| 0.7388888888888889 | 38.653 |
| 0.7395833333333334 | 38.653 |
| 0.7402777777777777 | 38.653 |
| 0.7409722222222223 | 43.079 |
| 0.7416666666666667 | 43.079 |
| 0.7423611111111111 | 47.511 |
| 0.7430555555555555 | 47.511 |
| 0.74375 | 47.511 |
| 0.7444444444444445 | 47.511 |
| 0.7451388888888889 | 51.951 |
| 0.7458333333333332 | 51.951 |
| 0.7465277777777778 | 56.398 |
| 0.7472222222222222 | 56.398 |
| 0.7479166666666667 | 56.398 |
| 0.748611111111111 | 56.398 |
| 0.7493055555555556 | 60.85 |
| 0.75 | 60.85 |
| 0.7506944444444444 | 65.31 |
| 0.751388888888889 | 65.31 |
| 0.7520833333333333 | 69.775 |
| 0.7527777777777778 | 74.246 |
| 0.7534722222222222 | 74.246 |
| 0.7541666666666668 | 78.722 |
| 0.7548611111111111 | 83.205 |
| 0.7555555555555555 | 83.205 |
| 0.75625 | 87.692 |
| 0.7569444444444445 | 87.692 |
| 0.7576388888888889 | 92.184 |
| 0.7583333333333333 | 96.682 |
| 0.7590277777777777 | 96.682 |
| 0.7597222222222223 | 96.682 |
| 0.7604166666666666 | 96.682 |
| 0.7611111111111111 | 96.682 |
| 0.7618055555555556 | 101.184 |
| 0.7625000000000001 | 101.184 |
| 0.7631944444444444 | 101.184 |
| 0.7638888888888888 | 101.184 |
| 0.7645833333333334 | 101.184 |
| 0.7652777777777778 | 96.682 |
| 0.7659722222222222 | 96.682 |
| 0.7666666666666666 | 92.184 |
| 0.7673611111111112 | 92.184 |
| 0.7680555555555556 | 87.692 |
| 0.7687499999999999 | 83.205 |
| 0.7694444444444444 | 78.722 |
| 0.7701388888888889 | 74.246 |
| 0.7708333333333334 | 69.775 |
| 0.7715277777777777 | 60.85 |
| 0.7722222222222223 | 56.398 |
| 0.7729166666666667 | 51.951 |
| 0.7736111111111111 | 47.511 |
| 0.7743055555555555 | 43.079 |
| 0.775 | 38.653 |
| 0.7756944444444445 | 38.653 |
| 0.7763888888888889 | 34.234 |
| 0.7770833333333332 | 34.234 |
| 0.7777777777777778 | 34.234 |
| 0.7784722222222222 | 34.234 |
| 0.7791666666666667 | 29.823 |
| 0.779861111111111 | 29.823 |
| 0.7805555555555556 | 25.419 |
| 0.78125 | 25.419 |
| 0.7819444444444444 | 21.024 |
| 0.782638888888889 | 21.024 |
| 0.7833333333333333 | 21.024 |
| 0.7840277777777778 | 21.024 |
| 0.7847222222222222 | 21.024 |
| 0.7854166666666668 | 21.024 |
| 0.7861111111111111 | 21.024 |
| 0.7868055555555555 | 21.024 |
| 0.7875 | 16.636 |
| 0.7881944444444445 | 21.024 |
| 0.7888888888888889 | 16.636 |
| 0.7895833333333333 | 16.636 |
| 0.7902777777777777 | 16.636 |
| 0.7909722222222223 | 16.636 |
| 0.7916666666666666 | 16.636 |
| 0.7923611111111111 | 16.636 |
| 0.7930555555555556 | 16.636 |
| 0.7937500000000001 | 12.257 |
| 0.7944444444444444 | 12.257 |
| 0.7951388888888888 | 12.257 |
| 0.7958333333333334 | 12.257 |
| 0.7965277777777778 | 12.257 |
| 0.7972222222222222 | 12.257 |
| 0.7979166666666666 | 12.257 |
| 0.7986111111111112 | 7.887 |
| 0.7993055555555556 | 7.887 |
| 0.7999999999999999 | 7.887 |
| 0.8006944444444444 | 7.887 |
| 0.8013888888888889 | 7.887 |
| 0.8020833333333334 | 7.887 |
| 0.8027777777777777 | 3.525 |
| 0.8034722222222223 | 3.525 |
| 0.8041666666666667 | 3.525 |
| 0.8048611111111111 | 3.525 |
| 0.8055555555555555 | 3.525 |
| 0.80625 | 3.525 |
| 0.8069444444444445 | 3.525 |
| 0.8076388888888889 | 3.525 |
| 0.8083333333333332 | 3.525 |
| 0.8090277777777778 | 3.525 |
| 0.8097222222222222 | 3.525 |
| 0.8104166666666667 | 3.525 |
| 0.811111111111111 | 3.525 |
| 0.8118055555555556 | 3.525 |
| 0.8125 | 3.525 |
| 0.8131944444444444 | 3.525 |
| 0.813888888888889 | 3.525 |
| 0.8145833333333333 | 3.525 |
| 0.8152777777777778 | 3.525 |
| 0.8159722222222222 | 3.525 |
| 0.8166666666666668 | 3.525 |
| 0.8173611111111111 | 3.525 |
| 0.8180555555555555 | 3.525 |
| 0.81875 | 3.525 |
| 0.8194444444444445 | 3.525 |
| 0.8201388888888889 | 3.525 |
| 0.8208333333333333 | 0 |
| 0.8215277777777777 | 3.525 |
| 0.8222222222222223 | 3.525 |
| 0.8229166666666666 | 3.525 |
| 0.8236111111111111 | 0 |
| 0.8243055555555556 | 0 |
| 0.8250000000000001 | 0 |
| 0.8256944444444444 | 0 |
| 0.8263888888888888 | 0 |
| 0.8270833333333334 | 0 |
| 0.8277777777777778 | 0 |
| 0.8284722222222222 | 0 |
| 0.8291666666666666 | 0 |
| 0.8298611111111112 | 0 |
| 0.8305555555555556 | 0 |
| 0.8312499999999999 | 0 |
| 0.8319444444444444 | 0 |
| 0.8326388888888889 | 0 |
| 0.8333333333333334 | 0 |
| 0.8340277777777777 | 0 |
| 0.8347222222222223 | 0 |
| 0.8354166666666667 | 0 |
| 0.8361111111111111 | 0 |
| 0.8368055555555555 | 0 |
| 0.8375 | 0 |
| 0.8381944444444445 | 0 |
| 0.8388888888888889 | 0 |
| 0.8395833333333332 | 0 |
| 0.8402777777777778 | 0 |
| 0.8409722222222222 | 0 |
| 0.8416666666666667 | 0 |
| 0.842361111111111 | 0 |
| 0.8430555555555556 | 0 |
| 0.84375 | 0 |
| 0.8444444444444444 | 0 |
| 0.845138888888889 | 0 |
| 0.8458333333333333 | 0 |
| 0.8465277777777778 | 0 |
| 0.8472222222222222 | 0 |
| 0.8479166666666668 | 0 |
| 0.8486111111111111 | 0 |
| 0.8493055555555555 | 0 |
| 0.85 | 0 |
| 0.8506944444444445 | 0 |
| 0.8513888888888889 | 0 |
| 0.8520833333333333 | 0 |
| 0.8527777777777777 | 0 |
| 0.8534722222222223 | 0 |
| 0.8541666666666666 | 0 |
| 0.8548611111111111 | 0 |
| 0.8555555555555556 | 0 |
| 0.8562500000000001 | 0 |
| 0.8569444444444444 | 0 |
| 0.8576388888888888 | 0 |
| 0.8583333333333334 | 0 |
| 0.8590277777777778 | 0 |
| 0.8597222222222222 | 0 |
| 0.8604166666666666 | 0 |
| 0.8611111111111112 | 0 |
| 0.8618055555555556 | 0 |
| 0.8624999999999999 | 0 |
| 0.8631944444444444 | 0 |
| 0.8638888888888889 | 0 |
| 0.8645833333333334 | 0 |
| 0.8652777777777777 | 0 |
| 0.8659722222222223 | 0 |
| 0.8666666666666667 | 0 |
| 0.8673611111111111 | 0 |
| 0.8680555555555555 | 0 |
| 0.86875 | 0 |
| 0.8694444444444445 | 0 |
| 0.8701388888888889 | 0 |
| 0.8708333333333332 | 0 |
| 0.8715277777777778 | 0 |
| 0.8722222222222222 | 0 |
| 0.8729166666666667 | 0 |
| 0.873611111111111 | 0 |
| 0.8743055555555556 | 0 |
| 0.875 | 0 |
| 0.8756944444444444 | 0 |
| 0.876388888888889 | 0 |
| 0.8770833333333333 | 0 |
| 0.8777777777777778 | 0 |
| 0.8784722222222222 | 0 |
| 0.8791666666666668 | 0 |
| 0.8798611111111111 | 0 |
| 0.8805555555555555 | 0 |
| 0.88125 | 0 |
| 0.8819444444444445 | 0 |
| 0.8826388888888889 | 0 |
| 0.8833333333333333 | 0 |
| 0.8840277777777777 | 0 |
| 0.8847222222222223 | 0 |
| 0.8854166666666666 | 0 |
| 0.8861111111111111 | 0 |
| 0.8868055555555556 | 0 |
| 0.8875000000000001 | 0 |
| 0.8881944444444444 | 0 |
| 0.8888888888888888 | 0 |
| 0.8895833333333334 | 0 |
| 0.8902777777777778 | 0 |
| 0.8909722222222222 | 0 |
| 0.8916666666666666 | 0 |
| 0.8923611111111112 | 0 |
| 0.8930555555555556 | 0 |
| 0.8937499999999999 | 0 |
| 0.8944444444444444 | 0 |
| 0.8951388888888889 | 0 |
| 0.8958333333333334 | 0 |
| 0.8965277777777777 | 0 |
| 0.8972222222222223 | 0 |
| 0.8979166666666667 | 0 |
| 0.8986111111111111 | 0 |
| 0.8993055555555555 | 0 |
| 0.9 | 0 |
| 0.9006944444444445 | 0 |
| 0.9013888888888889 | 0 |
| 0.9020833333333332 | 0 |
| 0.9027777777777778 | 0 |
| 0.9034722222222222 | 0 |
| 0.9041666666666667 | 0 |
| 0.904861111111111 | 0 |
| 0.9055555555555556 | 0 |
| 0.90625 | 0 |
| 0.9069444444444444 | 0 |
| 0.907638888888889 | 0 |
| 0.9083333333333333 | 0 |
| 0.9090277777777778 | 0 |
| 0.9097222222222222 | 0 |
| 0.9104166666666668 | 0 |
| 0.9111111111111111 | 0 |
| 0.9118055555555555 | 0 |
| 0.9125 | 0 |
| 0.9131944444444445 | 0 |
| 0.9138888888888889 | 0 |
| 0.9145833333333333 | 0 |
| 0.9152777777777777 | 0 |
| 0.9159722222222223 | 0 |
| 0.9166666666666666 | 0 |
| 0.9173611111111111 | 0 |
| 0.9180555555555556 | 0 |
| 0.9187500000000001 | 0 |
| 0.9194444444444444 | 0 |
| 0.9201388888888888 | 0 |
| 0.9208333333333334 | 0 |
| 0.9215277777777778 | 0 |
| 0.9222222222222222 | 0 |
| 0.9229166666666666 | 0 |
| 0.9236111111111112 | 0 |
| 0.9243055555555556 | 0 |
| 0.9249999999999999 | 0 |
| 0.9256944444444444 | 0 |
| 0.9263888888888889 | 0 |
| 0.9270833333333334 | 0 |
| 0.9277777777777777 | 0 |
| 0.9284722222222223 | 0 |
| 0.9291666666666667 | 0 |
| 0.9298611111111111 | 0 |
| 0.9305555555555555 | 0 |
| 0.93125 | 0 |
| 0.9319444444444445 | 0 |
| 0.9326388888888889 | 0 |
| 0.9333333333333332 | 0 |
| 0.9340277777777778 | 0 |
| 0.9347222222222222 | 0 |
| 0.9354166666666667 | 0 |
| 0.936111111111111 | 0 |
| 0.9368055555555556 | 0 |
| 0.9375 | 0 |
| 0.9381944444444444 | 0 |
| 0.938888888888889 | 0 |
| 0.9395833333333333 | 0 |
| 0.9402777777777778 | 0 |
| 0.9409722222222222 | 0 |
| 0.9416666666666668 | 0 |
| 0.9423611111111111 | 0 |
| 0.9430555555555555 | 0 |
| 0.94375 | 0 |
| 0.9444444444444445 | 0 |
| 0.9451388888888889 | 0 |
| 0.9458333333333333 | 0 |
| 0.9465277777777777 | 0 |
| 0.9472222222222223 | 0 |
| 0.9479166666666666 | 0 |
| 0.9486111111111111 | 0 |
| 0.9493055555555556 | 0 |
| 0.9500000000000001 | 0 |
| 0.9506944444444444 | 0 |
| 0.9513888888888888 | 0 |
| 0.9520833333333334 | 0 |
| 0.9527777777777778 | 0 |
| 0.9534722222222222 | 0 |
| 0.9541666666666666 | 0 |
| 0.9548611111111112 | 0 |
| 0.9555555555555556 | 0 |
| 0.9562499999999999 | 0 |
| 0.9569444444444444 | 0 |
| 0.9576388888888889 | 0 |
| 0.9583333333333334 | 0 |
| 0.9590277777777777 | 0 |
| 0.9597222222222223 | 0 |
| 0.9604166666666667 | 0 |
| 0.9611111111111111 | 0 |
| 0.9618055555555555 | 0 |
| 0.9625 | 0 |
| 0.9631944444444445 | 0 |
| 0.9638888888888889 | 0 |
| 0.9645833333333332 | 0 |
| 0.9652777777777778 | 0 |
| 0.9659722222222222 | 0 |
| 0.9666666666666667 | 0 |
| 0.967361111111111 | 0 |
| 0.9680555555555556 | 0 |
| 0.96875 | 0 |
| 0.9694444444444444 | 0 |
| 0.970138888888889 | 0 |
| 0.9708333333333333 | 0 |
| 0.9715277777777778 | 0 |
| 0.9722222222222222 | 0 |
| 0.9729166666666668 | 0 |
| 0.9736111111111111 | 0 |
| 0.9743055555555555 | 0 |
| 0.975 | 0 |
| 0.9756944444444445 | 0 |
| 0.9763888888888889 | 0 |
| 0.9770833333333333 | 0 |
| 0.9777777777777777 | 0 |
| 0.9784722222222223 | 0 |
| 0.9791666666666666 | 0 |
| 0.9798611111111111 | 0 |
| 0.9805555555555556 | 0 |
| 0.9812500000000001 | 0 |
| 0.9819444444444444 | 0 |
| 0.9826388888888888 | 0 |
| 0.9833333333333334 | 0 |
| 0.9840277777777778 | 0 |
| 0.9847222222222222 | 0 |
| 0.9854166666666666 | 0 |
| 0.9861111111111112 | 0 |
| 0.9868055555555556 | 0 |
| 0.9874999999999999 | 0 |
| 0.9881944444444444 | 0 |
| 0.9888888888888889 | 0 |
| 0.9895833333333334 | 0 |
| 0.9902777777777777 | 0 |
| 0.9909722222222223 | 0 |
| 0.9916666666666667 | 0 |
| 0.9923611111111111 | 0 |
| 0.9930555555555555 | 0 |
| 0.99375 | 0 |
| 0.9944444444444445 | 0 |
| 0.9951388888888889 | 0 |
| 0.9958333333333332 | 0 |
| 0.9965277777777778 | 0 |
| 0.9972222222222222 | 0 |
| 0.9979166666666667 | 0 |
| 0.998611111111111 | 0 |
| 0.9993055555555556 | 0 |